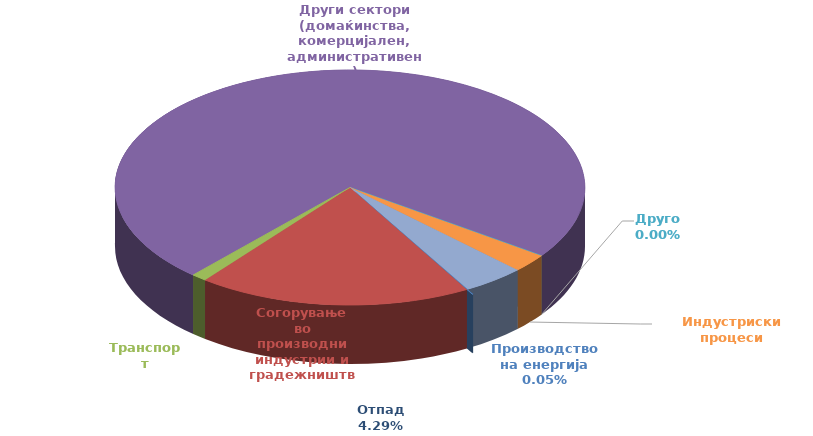
| Category | Series 0 |
|---|---|
| 0 | 0.002 |
| 1 | 0.717 |
| 2 | 0.04 |
| 3 | 2.787 |
| 4 | 0 |
| 5 | 0.096 |
| 6 | 0.163 |